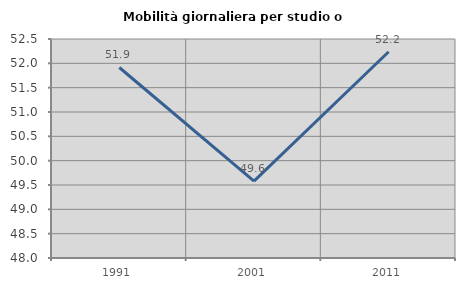
| Category | Mobilità giornaliera per studio o lavoro |
|---|---|
| 1991.0 | 51.915 |
| 2001.0 | 49.58 |
| 2011.0 | 52.239 |